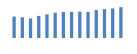
| Category | Exportações (1) |
|---|---|
| 0 | 595986.616 |
| 1 | 575965.577 |
| 2 | 544011.291 |
| 3 | 614380.205 |
| 4 | 656918.26 |
| 5 | 703504.835 |
| 6 | 720793.562 |
| 7 | 726284.803 |
| 8 | 735533.905 |
| 9 | 723973.625 |
| 10 | 778041 |
| 11 | 800341.537 |
| 12 | 819402.338 |
| 13 | 856189.676 |